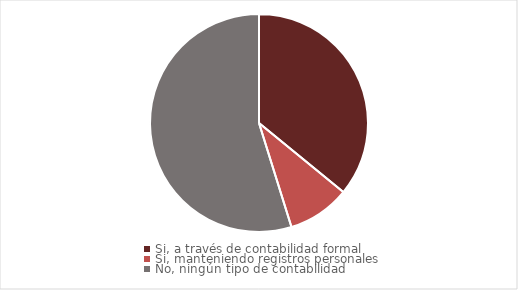
| Category | % |
|---|---|
| Si, a través de contabilidad formal | 0.359 |
| Si, manteniendo registros personales | 0.093 |
| No, ningún tipo de contabilidad | 0.548 |